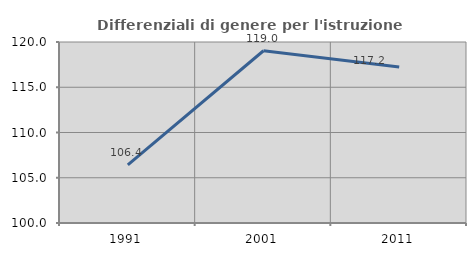
| Category | Differenziali di genere per l'istruzione superiore |
|---|---|
| 1991.0 | 106.424 |
| 2001.0 | 119.034 |
| 2011.0 | 117.225 |